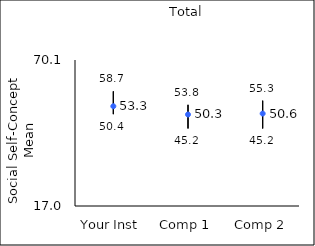
| Category | 25th percentile | 75th percentile | Mean |
|---|---|---|---|
| Your Inst | 50.4 | 58.7 | 53.28 |
| Comp 1 | 45.2 | 53.8 | 50.28 |
| Comp 2 | 45.2 | 55.3 | 50.62 |